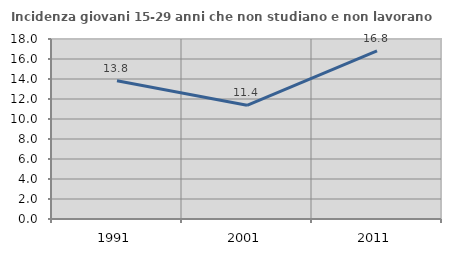
| Category | Incidenza giovani 15-29 anni che non studiano e non lavorano  |
|---|---|
| 1991.0 | 13.822 |
| 2001.0 | 11.366 |
| 2011.0 | 16.818 |